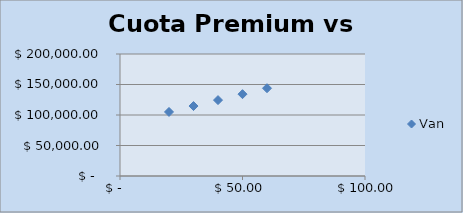
| Category | Van |
|---|---|
| 30.0 | 114699.073 |
| 20.0 | 104975.21 |
| 40.0 | 124422.936 |
| 50.0 | 134146.799 |
| 60.0 | 143870.662 |